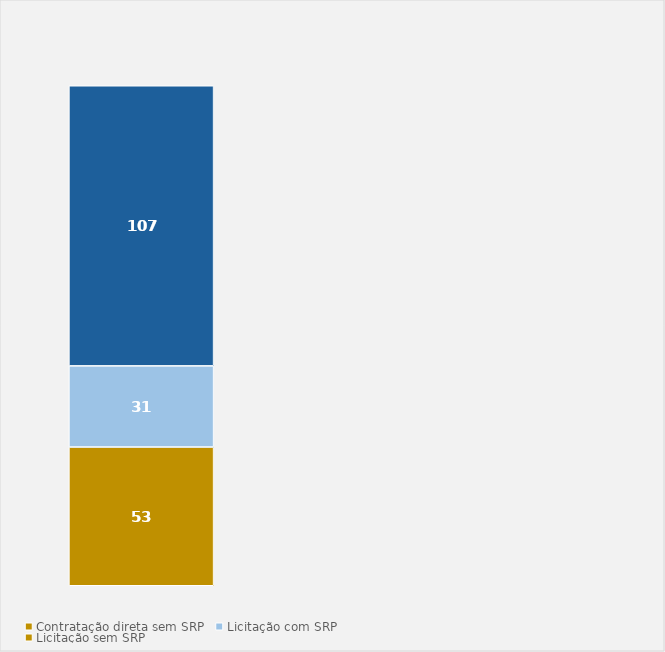
| Category | Contratação direta sem SRP | Licitação com SRP | Licitação sem SRP |
|---|---|---|---|
| Total | 53 | 31 | 107 |